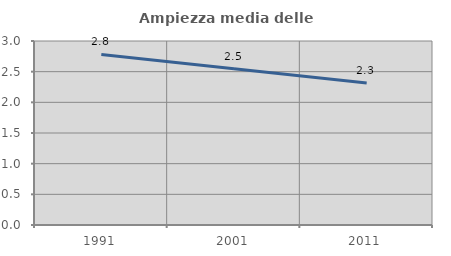
| Category | Ampiezza media delle famiglie |
|---|---|
| 1991.0 | 2.781 |
| 2001.0 | 2.546 |
| 2011.0 | 2.315 |